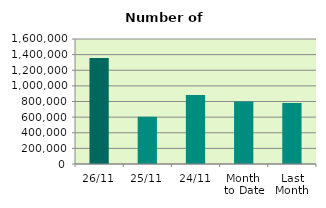
| Category | Series 0 |
|---|---|
| 26/11 | 1355328 |
| 25/11 | 604480 |
| 24/11 | 882926 |
| Month 
to Date | 799087.1 |
| Last
Month | 780428.952 |